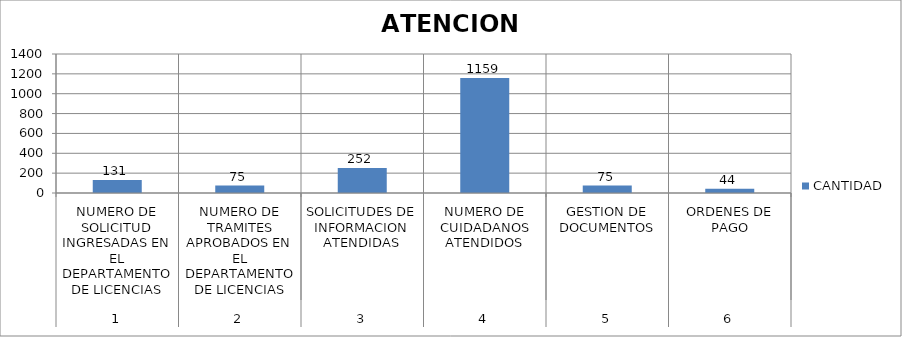
| Category | CANTIDAD |
|---|---|
| 0 | 131 |
| 1 | 75 |
| 2 | 252 |
| 3 | 1159 |
| 4 | 75 |
| 5 | 44 |